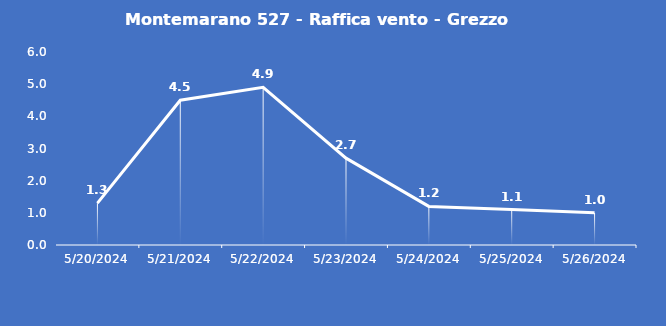
| Category | Montemarano 527 - Raffica vento - Grezzo (m/s) |
|---|---|
| 5/20/24 | 1.3 |
| 5/21/24 | 4.5 |
| 5/22/24 | 4.9 |
| 5/23/24 | 2.7 |
| 5/24/24 | 1.2 |
| 5/25/24 | 1.1 |
| 5/26/24 | 1 |